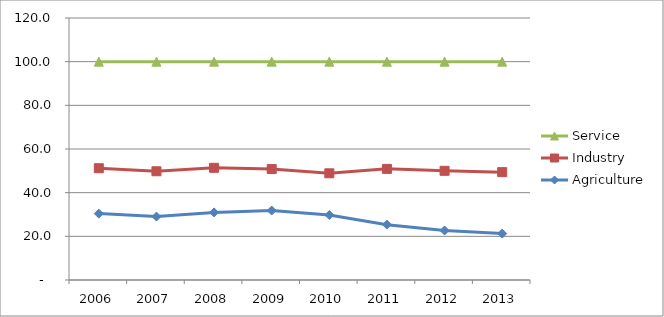
| Category | Agriculture | Industry | Service |
|---|---|---|---|
| 2006.0 | 30.405 | 20.799 | 48.796 |
| 2007.0 | 29.05 | 20.747 | 50.203 |
| 2008.0 | 30.962 | 20.425 | 48.614 |
| 2009.0 | 31.806 | 19 | 49.194 |
| 2010.0 | 29.754 | 19.117 | 51.129 |
| 2011.0 | 25.343 | 25.558 | 49.099 |
| 2012.0 | 22.665 | 27.348 | 49.987 |
| 2013.0 | 21.262 | 28.138 | 50.6 |